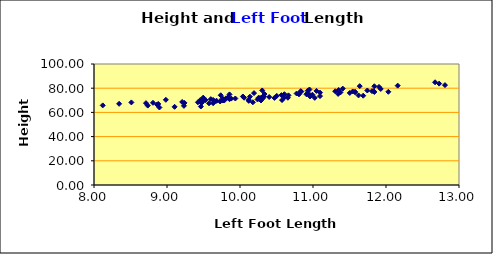
| Category | Height |
|---|---|
| 11.544 | 77.31 |
| 9.632 | 67.58 |
| 8.984 | 70.4 |
| 9.464 | 64.84 |
| 12.032 | 77.03 |
| 11.408 | 79.66 |
| 10.608 | 72.37 |
| 10.328 | 73.18 |
| 11.808 | 77.6 |
| 9.88 | 71.4 |
| 10.136 | 72.98 |
| 9.495999999999999 | 69.36 |
| 10.912 | 74.88 |
| 8.712 | 67.65 |
| 11.744 | 78.1 |
| 10.256 | 72.2 |
| 9.472 | 67.77 |
| 11.096 | 73.49 |
| 10.288 | 69.86 |
| 11.576 | 77.05 |
| 11.928 | 79.36 |
| 11.344 | 75.29 |
| 8.12 | 65.79 |
| 9.104000000000001 | 64.6 |
| 11.64 | 81.71 |
| 9.784 | 69.83 |
| 11.904 | 81.06 |
| 11.096 | 76.33 |
| 9.576 | 67.52 |
| 12.16 | 82.09 |
| 11.504000000000001 | 76.07 |
| 8.344 | 67.09 |
| 10.28 | 71.82 |
| 10.568000000000001 | 74.27 |
| 12.728 | 83.79 |
| 10.056000000000001 | 72.11 |
| 10.12 | 69.55 |
| 9.936 | 71.49 |
| 10.304 | 72.52 |
| 10.96 | 73.19 |
| 9.232 | 65.4 |
| 10.472 | 71.98 |
| 11.352 | 78.55 |
| 9.856 | 70.91 |
| 9.528 | 70.15 |
| 11.687999999999999 | 73.8 |
| 9.768 | 69.81 |
| 10.776 | 75.63 |
| 9.76 | 71.55 |
| 11.84 | 76.86 |
| 9.424 | 68.35 |
| 11.831999999999999 | 77.58 |
| 9.856 | 74.88 |
| 9.84 | 72.37 |
| 10.84 | 77.21 |
| 8.88 | 66.96 |
| 10.808 | 74.94 |
| 9.24 | 67.84 |
| 11.376000000000001 | 76.5 |
| 12.808000000000002 | 82.55 |
| 10.656 | 72.1 |
| 8.808 | 67.95 |
| 10.176 | 68.36 |
| 10.928 | 77.95 |
| 11.048 | 77.76 |
| 9.488 | 70.3 |
| 9.656 | 69.27 |
| 9.456 | 70.19 |
| 10.04 | 73.16 |
| 9.808 | 71.64 |
| 11.024 | 72.04 |
| 10.12 | 70.28 |
| 9.6 | 70.98 |
| 10.992 | 74.61 |
| 10.312000000000001 | 71.54 |
| 11.623999999999999 | 74.04 |
| 10.664 | 74.09 |
| 10.504000000000001 | 73.65 |
| 9.728 | 69.01 |
| 10.831999999999999 | 77.58 |
| 11.84 | 81.61 |
| 8.895999999999999 | 64.05 |
| 9.495999999999999 | 72.2 |
| 10.608 | 75.06 |
| 12.672 | 84.9 |
| 9.831999999999999 | 72.21 |
| 8.736 | 65.63 |
| 8.512 | 68.25 |
| 7.776000000000001 | 60.93 |
| 11.304 | 77.5 |
| 8.864 | 66.4 |
| 9.632 | 70.25 |
| 10.92 | 75.48 |
| 10.4 | 72.74 |
| 10.576 | 70.18 |
| 10.192 | 75.96 |
| 10.952 | 74.75 |
| 11.576 | 76.63 |
| 10.304 | 78.15 |
| 10.952 | 78.92 |
| 9.208 | 68.64 |
| 10.24 | 70.68 |
| 10.336 | 75.19 |
| 9.736 | 74.16 |
| 9.68 | 69.57 |